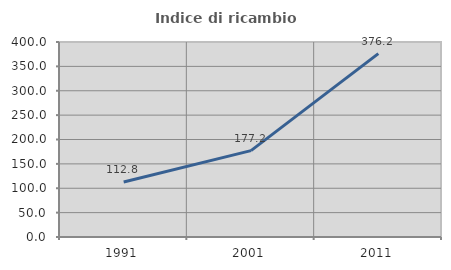
| Category | Indice di ricambio occupazionale  |
|---|---|
| 1991.0 | 112.823 |
| 2001.0 | 177.209 |
| 2011.0 | 376.231 |